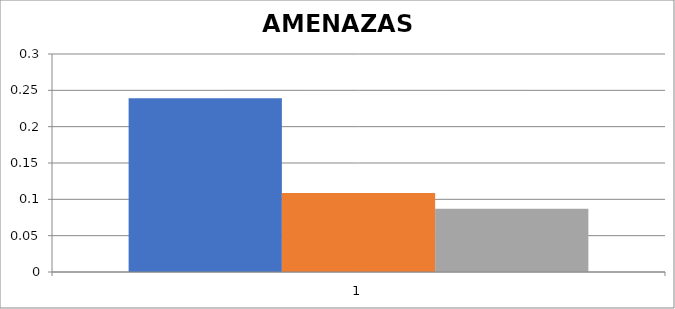
| Category | Cambios frecuentes de normatividad-Exigencias de los entes de control  por la normatividad.  | Sanciones por no cumplimiento con informes normativos de entes de control y/o vigilancia y/o requerimientos varios/ de procesos misionales  | Los recortes presupuestales del orden Nacional y Departamental |
|---|---|---|---|
| 0 | 0.239 | 0.109 | 0.087 |